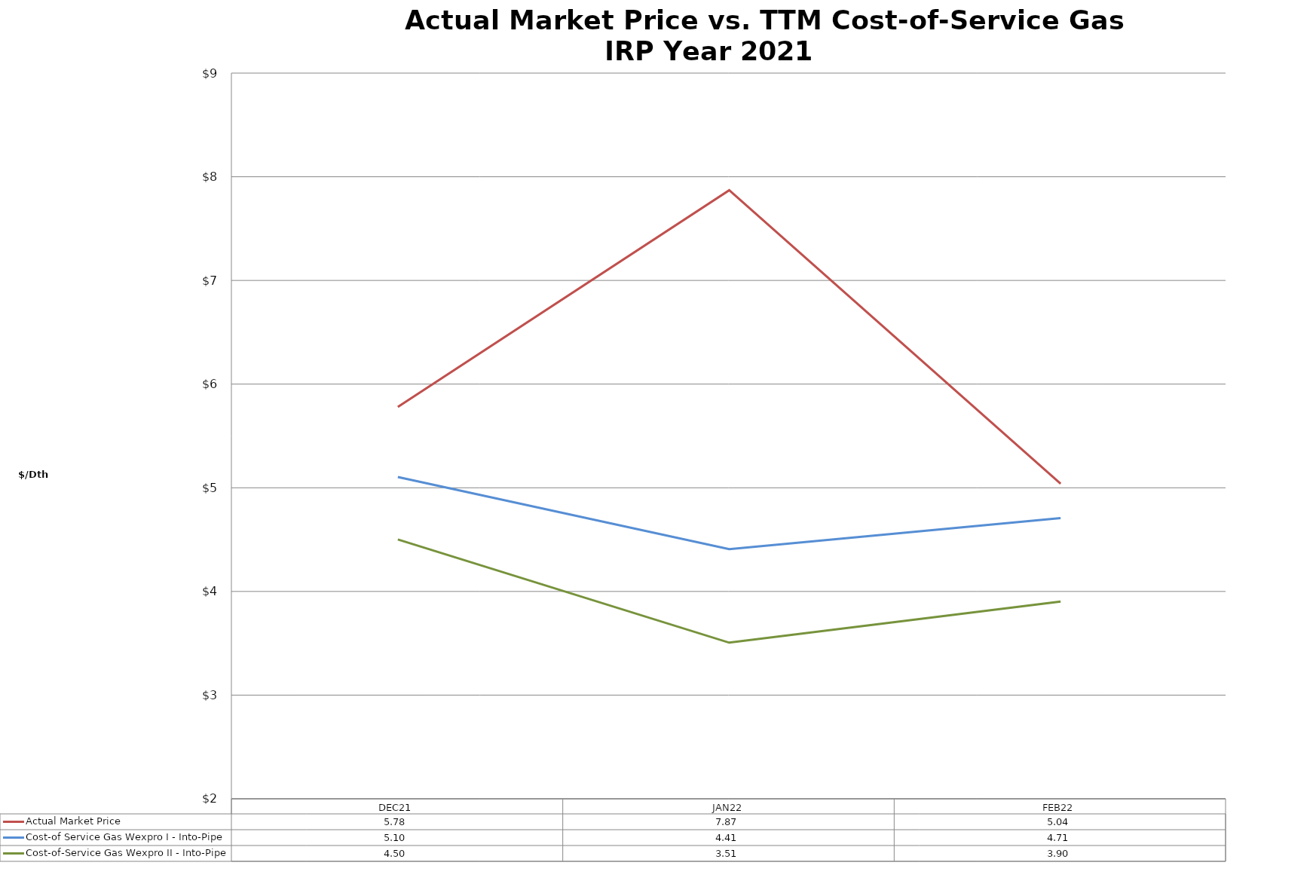
| Category | Actual Market Price | Cost-of Service Gas Wexpro I - Into-Pipe | Cost-of-Service Gas Wexpro II - Into-Pipe |
|---|---|---|---|
| DEC21 | 5.78 | 5.104 | 4.501 |
| JAN22 | 7.87 | 4.408 | 3.506 |
| FEB22 | 5.04 | 4.708 | 3.903 |